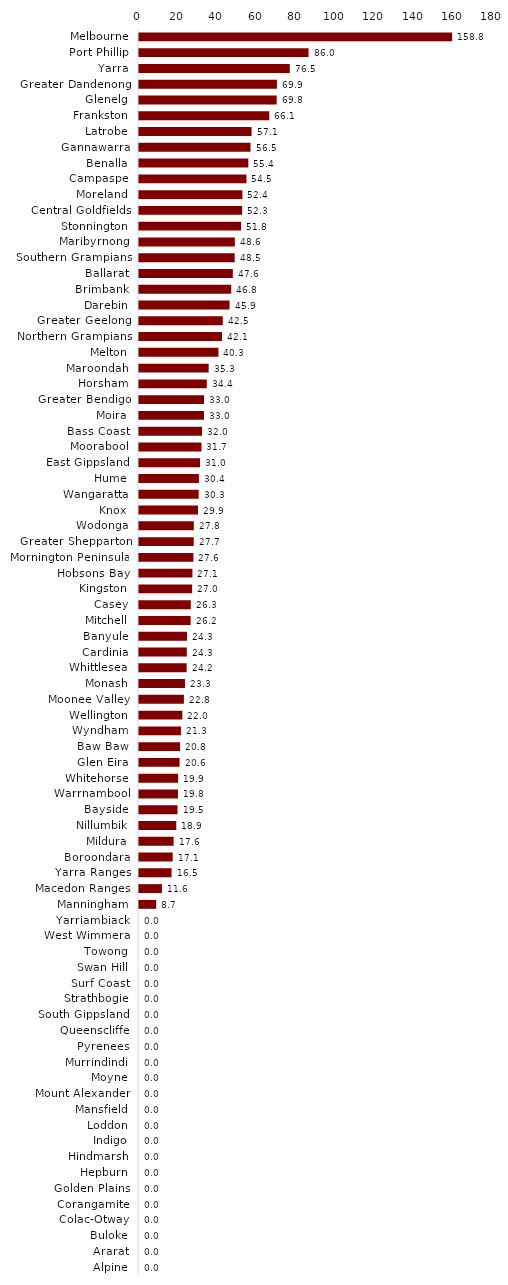
| Category | Series 0 |
|---|---|
| Melbourne | 158.78 |
| Port Phillip | 85.98 |
| Yarra | 76.47 |
| Greater Dandenong | 69.93 |
| Glenelg | 69.8 |
| Frankston | 66.05 |
| Latrobe | 57.08 |
| Gannawarra | 56.54 |
| Benalla | 55.44 |
| Campaspe | 54.48 |
| Moreland | 52.44 |
| Central Goldfields | 52.31 |
| Stonnington | 51.75 |
| Maribyrnong | 48.61 |
| Southern Grampians | 48.52 |
| Ballarat | 47.58 |
| Brimbank | 46.77 |
| Darebin | 45.9 |
| Greater Geelong | 42.47 |
| Northern Grampians | 42.07 |
| Melton | 40.28 |
| Maroondah | 35.32 |
| Horsham | 34.37 |
| Greater Bendigo | 33 |
| Moira | 32.95 |
| Bass Coast | 31.99 |
| Moorabool | 31.67 |
| East Gippsland | 30.96 |
| Hume | 30.38 |
| Wangaratta | 30.26 |
| Knox | 29.91 |
| Wodonga | 27.79 |
| Greater Shepparton | 27.73 |
| Mornington Peninsula | 27.58 |
| Hobsons Bay | 27.09 |
| Kingston | 26.95 |
| Casey | 26.26 |
| Mitchell | 26.17 |
| Banyule | 24.34 |
| Cardinia | 24.26 |
| Whittlesea | 24.16 |
| Monash | 23.31 |
| Moonee Valley | 22.77 |
| Wellington | 22 |
| Wyndham | 21.27 |
| Baw Baw | 20.84 |
| Glen Eira | 20.57 |
| Whitehorse | 19.86 |
| Warrnambool | 19.76 |
| Bayside | 19.54 |
| Nillumbik | 18.91 |
| Mildura | 17.55 |
| Boroondara | 17.07 |
| Yarra Ranges | 16.52 |
| Macedon Ranges | 11.63 |
| Manningham | 8.74 |
| Yarriambiack | 0 |
| West Wimmera | 0 |
| Towong | 0 |
| Swan Hill | 0 |
| Surf Coast | 0 |
| Strathbogie | 0 |
| South Gippsland | 0 |
| Queenscliffe | 0 |
| Pyrenees | 0 |
| Murrindindi | 0 |
| Moyne | 0 |
| Mount Alexander | 0 |
| Mansfield | 0 |
| Loddon | 0 |
| Indigo | 0 |
| Hindmarsh | 0 |
| Hepburn | 0 |
| Golden Plains | 0 |
| Corangamite | 0 |
| Colac-Otway | 0 |
| Buloke | 0 |
| Ararat | 0 |
| Alpine | 0 |